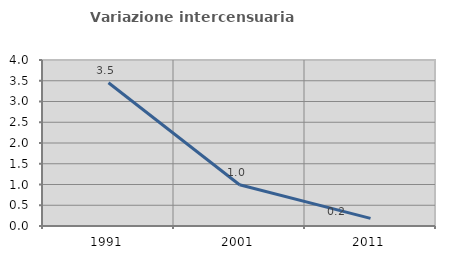
| Category | Variazione intercensuaria annua |
|---|---|
| 1991.0 | 3.452 |
| 2001.0 | 0.993 |
| 2011.0 | 0.183 |